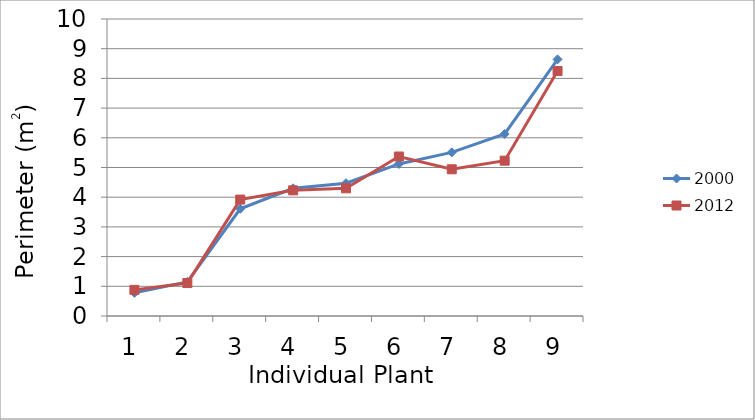
| Category | 2000 | 2012 |
|---|---|---|
| 0 | 0.78 | 0.88 |
| 1 | 1.15 | 1.11 |
| 2 | 3.61 | 3.92 |
| 3 | 4.3 | 4.23 |
| 4 | 4.47 | 4.3 |
| 5 | 5.12 | 5.37 |
| 6 | 5.51 | 4.94 |
| 7 | 6.13 | 5.23 |
| 8 | 8.64 | 8.25 |